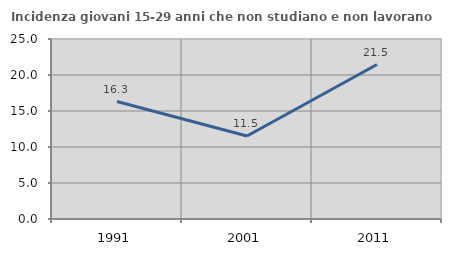
| Category | Incidenza giovani 15-29 anni che non studiano e non lavorano  |
|---|---|
| 1991.0 | 16.315 |
| 2001.0 | 11.535 |
| 2011.0 | 21.457 |